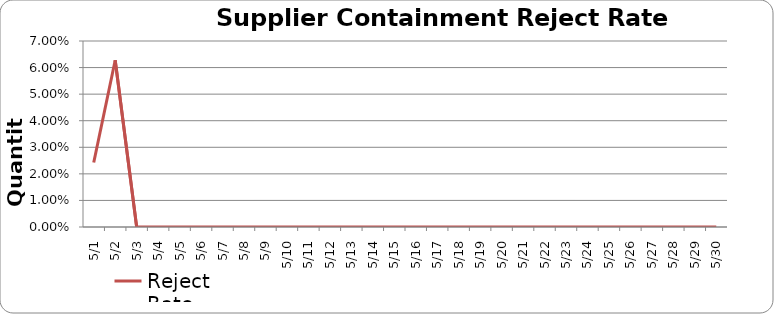
| Category | Reject Rate |
|---|---|
| 2012-05-01 | 0.024 |
| 2012-05-02 | 0.063 |
| 2012-05-03 | 0 |
| 2012-05-04 | 0 |
| 2012-05-05 | 0 |
| 2012-05-06 | 0 |
| 2012-05-07 | 0 |
| 2012-05-08 | 0 |
| 2012-05-09 | 0 |
| 2012-05-10 | 0 |
| 2012-05-11 | 0 |
| 2012-05-12 | 0 |
| 2012-05-13 | 0 |
| 2012-05-14 | 0 |
| 2012-05-15 | 0 |
| 2012-05-16 | 0 |
| 2012-05-17 | 0 |
| 2012-05-18 | 0 |
| 2012-05-19 | 0 |
| 2012-05-20 | 0 |
| 2012-05-21 | 0 |
| 2012-05-22 | 0 |
| 2012-05-23 | 0 |
| 2012-05-24 | 0 |
| 2012-05-25 | 0 |
| 2012-05-26 | 0 |
| 2012-05-27 | 0 |
| 2012-05-28 | 0 |
| 2012-05-29 | 0 |
| 2012-05-30 | 0 |